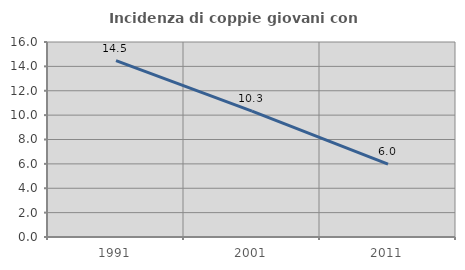
| Category | Incidenza di coppie giovani con figli |
|---|---|
| 1991.0 | 14.467 |
| 2001.0 | 10.323 |
| 2011.0 | 5.983 |